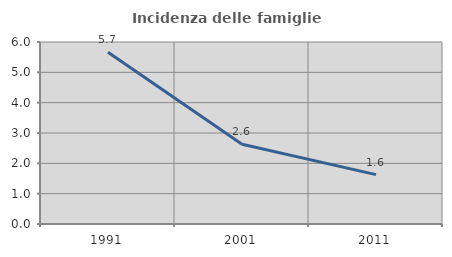
| Category | Incidenza delle famiglie numerose |
|---|---|
| 1991.0 | 5.664 |
| 2001.0 | 2.627 |
| 2011.0 | 1.629 |